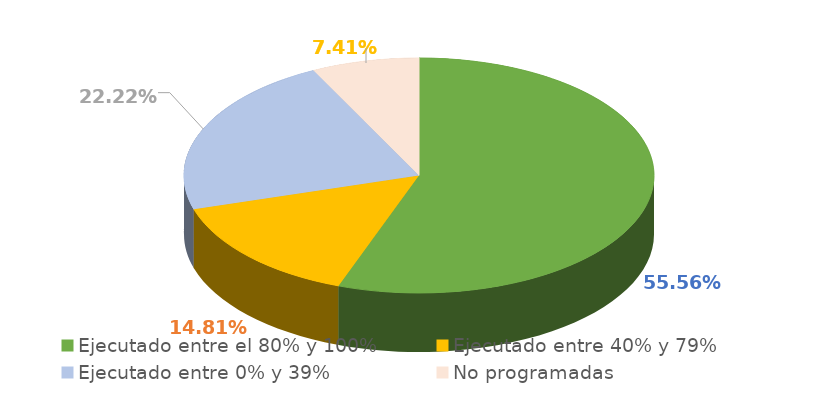
| Category | Series 0 |
|---|---|
| Ejecutado entre el 80% y 100% | 0.556 |
| Ejecutado entre 40% y 79% | 0.148 |
| Ejecutado entre 0% y 39% | 0.222 |
| No programadas | 0.074 |